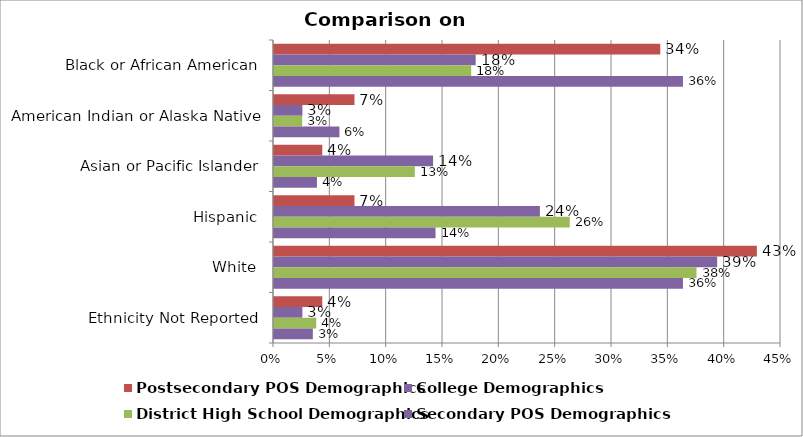
| Category | Postsecondary POS Demographics | College Demographics | District High School Demographics | Secondary POS Demographics |
|---|---|---|---|---|
| Black or African American | 0.343 | 0.179 | 0.175 | 0.363 |
| American Indian or Alaska Native | 0.071 | 0.025 | 0.025 | 0.058 |
| Asian or Pacific Islander | 0.043 | 0.141 | 0.125 | 0.038 |
| Hispanic | 0.071 | 0.236 | 0.262 | 0.143 |
| White | 0.429 | 0.393 | 0.375 | 0.363 |
| Ethnicity Not Reported | 0.043 | 0.025 | 0.038 | 0.034 |